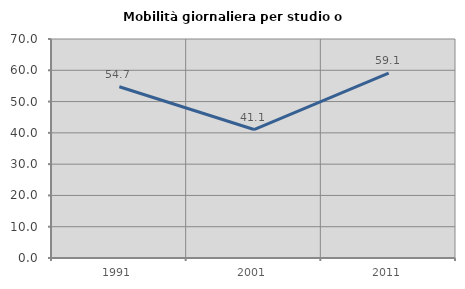
| Category | Mobilità giornaliera per studio o lavoro |
|---|---|
| 1991.0 | 54.734 |
| 2001.0 | 41.06 |
| 2011.0 | 59.091 |